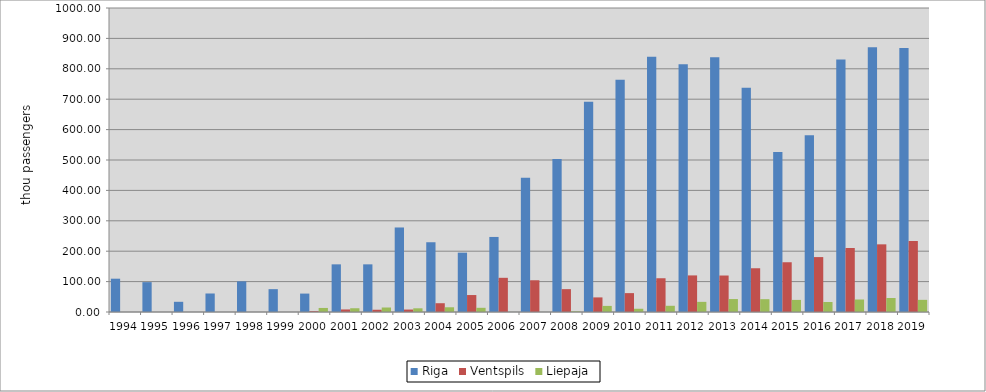
| Category | Riga | Ventspils | Liepaja |
|---|---|---|---|
| 1994.0 | 109.57 | 0 | 0 |
| 1995.0 | 98.19 | 0 | 0 |
| 1996.0 | 33.55 | 0 | 0 |
| 1997.0 | 60.88 | 0 | 0 |
| 1998.0 | 100.833 | 0 | 0 |
| 1999.0 | 75.147 | 0 | 0 |
| 2000.0 | 60.586 | 2.681 | 13.311 |
| 2001.0 | 156.77 | 8.37 | 12.356 |
| 2002.0 | 156.77 | 7.404 | 14.786 |
| 2003.0 | 278.028 | 8.032 | 12.162 |
| 2004.0 | 229.474 | 28.887 | 15.53 |
| 2005.0 | 195.195 | 55.788 | 13.812 |
| 2006.0 | 246.885 | 112.46 | 0.153 |
| 2007.0 | 441.914 | 104.422 | 0.116 |
| 2008.0 | 503.594 | 75.174 | 2.115 |
| 2009.0 | 691.236 | 48.012 | 20.041 |
| 2010.0 | 764.001 | 62.109 | 10.674 |
| 2011.0 | 839.712 | 111.019 | 20.432 |
| 2012.0 | 815.026 | 120.344 | 33.361 |
| 2013.0 | 837.665 | 120.014 | 42.607 |
| 2014.0 | 737.865 | 143.891 | 42.203 |
| 2015.0 | 526.243 | 163.666 | 39.782 |
| 2016.0 | 581.577 | 180.632 | 32.992 |
| 2017.0 | 830.38 | 210.532 | 41.111 |
| 2018.0 | 870.825 | 222.562 | 46.113 |
| 2019.0 | 868.656 | 233.537 | 39.987 |